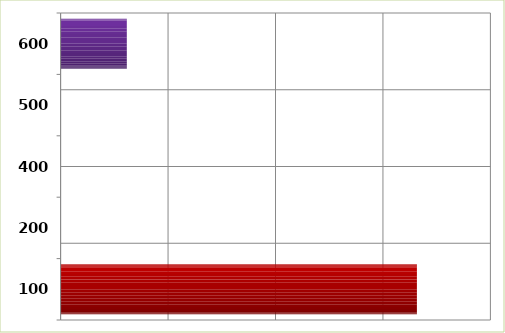
| Category | Series 0 |
|---|---|
| 100.0 | 1658000 |
| 200.0 | 0 |
| 400.0 | 0 |
| 500.0 | 0 |
| 600.0 | 308140 |